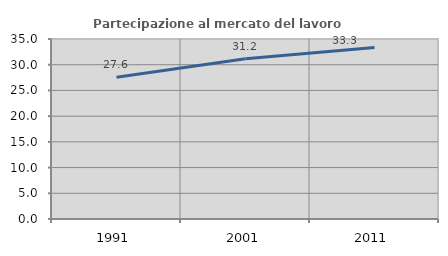
| Category | Partecipazione al mercato del lavoro  femminile |
|---|---|
| 1991.0 | 27.551 |
| 2001.0 | 31.169 |
| 2011.0 | 33.333 |